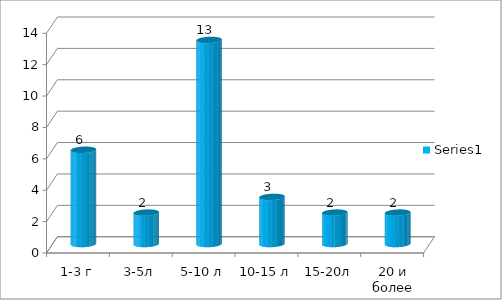
| Category | Series 0 |
|---|---|
| 1-3 г | 6 |
| 3-5л | 2 |
| 5-10 л | 13 |
| 10-15 л | 3 |
| 15-20л | 2 |
| 20 и более | 2 |